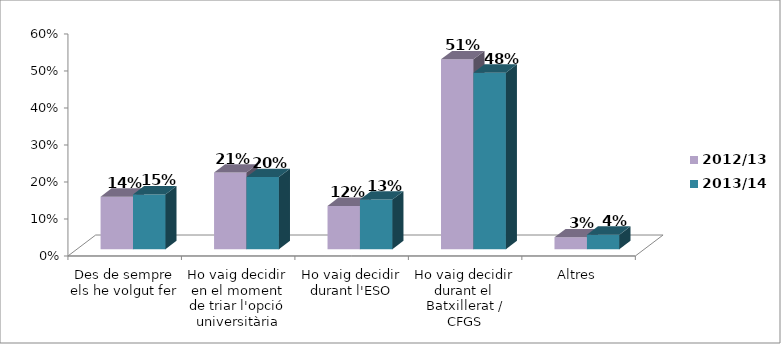
| Category | 2012/13 | 2013/14 |
|---|---|---|
| Des de sempre els he volgut fer | 0.142 | 0.148 |
| Ho vaig decidir en el moment de triar l'opció universitària | 0.207 | 0.195 |
| Ho vaig decidir durant l'ESO | 0.117 | 0.134 |
| Ho vaig decidir durant el Batxillerat / CFGS | 0.513 | 0.477 |
| Altres | 0.032 | 0.039 |